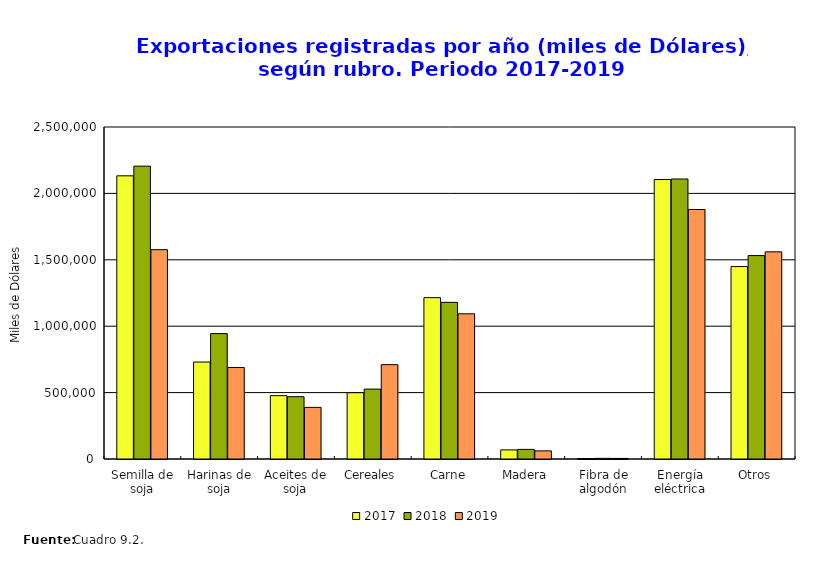
| Category | 2017 | 2018 | 2019 |
|---|---|---|---|
| Semilla de soja | 2132416.623 | 2205038.912 | 1576120.072 |
| Harinas de soja | 730287 | 944331.671 | 689277.788 |
| Aceites de soja | 477129.927 | 469237.623 | 388711.294 |
| Cereales | 499181.499 | 526306.518 | 710471.422 |
| Carne | 1215033 | 1179563.827 | 1093260.955 |
| Madera | 68549.862 | 72269.286 | 61109.738 |
| Fibra de algodón | 3574.624 | 4844.794 | 4510.634 |
| Energía eléctrica | 2104509.852 | 2108641.674 | 1878673.427 |
| Otros | 1449150.655 | 1531906.38 | 1559876.966 |